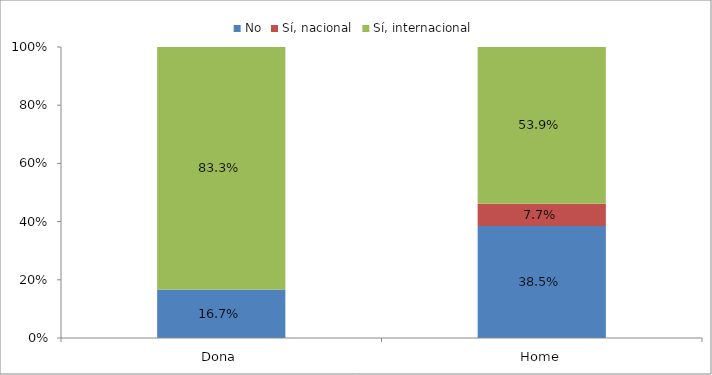
| Category | No | Sí, nacional | Sí, internacional |
|---|---|---|---|
| Dona | 0.167 | 0 | 0.833 |
| Home | 0.385 | 0.077 | 0.538 |